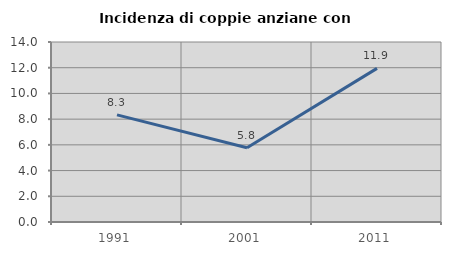
| Category | Incidenza di coppie anziane con figli |
|---|---|
| 1991.0 | 8.333 |
| 2001.0 | 5.78 |
| 2011.0 | 11.95 |